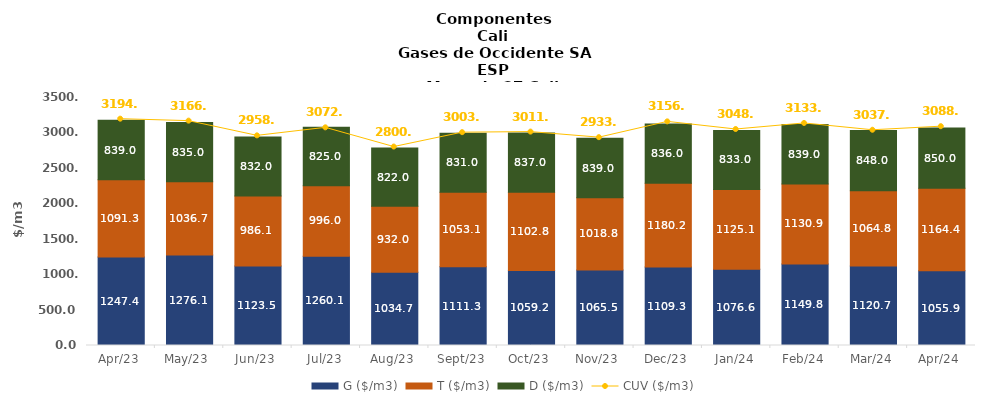
| Category | G ($/m3) | T ($/m3) | D ($/m3) |
|---|---|---|---|
| 2023-04-01 | 1247.38 | 1091.29 | 839 |
| 2023-05-01 | 1276.06 | 1036.67 | 835 |
| 2023-06-01 | 1123.54 | 986.08 | 832 |
| 2023-07-01 | 1260.12 | 995.95 | 825 |
| 2023-08-01 | 1034.65 | 931.99 | 822 |
| 2023-09-01 | 1111.32 | 1053.08 | 831 |
| 2023-10-01 | 1059.24 | 1102.78 | 837 |
| 2023-11-01 | 1065.48 | 1018.81 | 839 |
| 2023-12-01 | 1109.29 | 1180.21 | 836 |
| 2024-01-01 | 1076.64 | 1125.08 | 833 |
| 2024-02-01 | 1149.84 | 1130.93 | 839 |
| 2024-03-01 | 1120.7 | 1064.84 | 848 |
| 2024-04-01 | 1055.86 | 1164.42 | 850 |